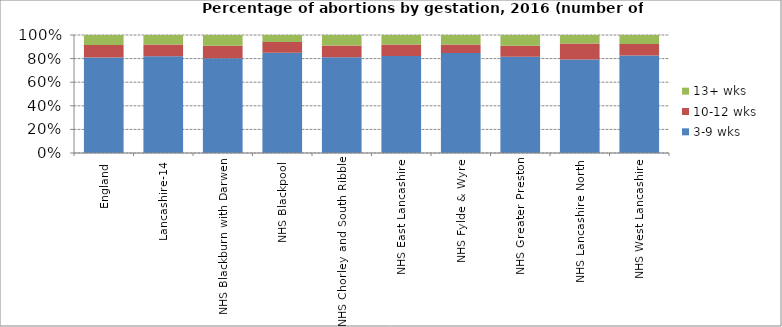
| Category | 3-9 wks | 10-12 wks | 13+ wks |
|---|---|---|---|
| England | 80.868 | 10.62 | 8.512 |
| Lancashire-14 | 82.033 | 9.882 | 8.085 |
| NHS Blackburn with Darwen | 80.261 | 10.615 | 9.125 |
| NHS Blackpool | 84.99 | 9.128 | 5.882 |
| NHS Chorley and South Ribble | 81.211 | 9.812 | 8.977 |
| NHS East Lancashire | 82.107 | 9.837 | 8.056 |
| NHS Fylde & Wyre | 84.81 | 7.089 | 8.101 |
| NHS Greater Preston | 81.536 | 9.453 | 9.01 |
| NHS Lancashire North | 79.135 | 13.74 | 7.125 |
| NHS West Lancashire | 82.609 | 9.699 | 7.692 |